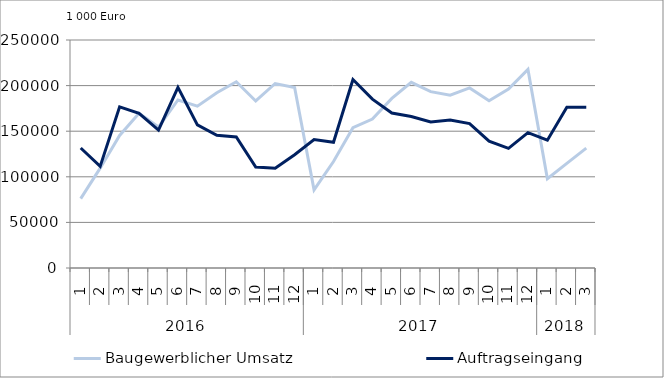
| Category | Baugewerblicher Umsatz | Auftragseingang |
|---|---|---|
| 0 | 76043.538 | 131571.482 |
| 1 | 109483.268 | 111467.248 |
| 2 | 145343.559 | 176673.268 |
| 3 | 169660.551 | 169566.96 |
| 4 | 154554.865 | 151228.165 |
| 5 | 184236.137 | 198035.655 |
| 6 | 177444.278 | 156900.898 |
| 7 | 192230.472 | 145537.167 |
| 8 | 204178.065 | 143616.217 |
| 9 | 183173.849 | 110770.94 |
| 10 | 202302.279 | 109384.188 |
| 11 | 197832.096 | 124193.91 |
| 12 | 85701.947 | 140751.008 |
| 13 | 116743.276 | 137863.383 |
| 14 | 153810.055 | 206710.579 |
| 15 | 163342.989 | 185183.797 |
| 16 | 185946.221 | 169878.51 |
| 17 | 203627.91 | 166148.392 |
| 18 | 193377.256 | 160134.206 |
| 19 | 189429.952 | 162221.206 |
| 20 | 197405.279 | 158305.285 |
| 21 | 183450.026 | 139156.761 |
| 22 | 196209.214 | 131165.419 |
| 23 | 217688.447 | 148434.901 |
| 24 | 97959.056 | 140119.385 |
| 25 | 114756.787 | 176330.213 |
| 26 | 131454.642 | 176241.061 |